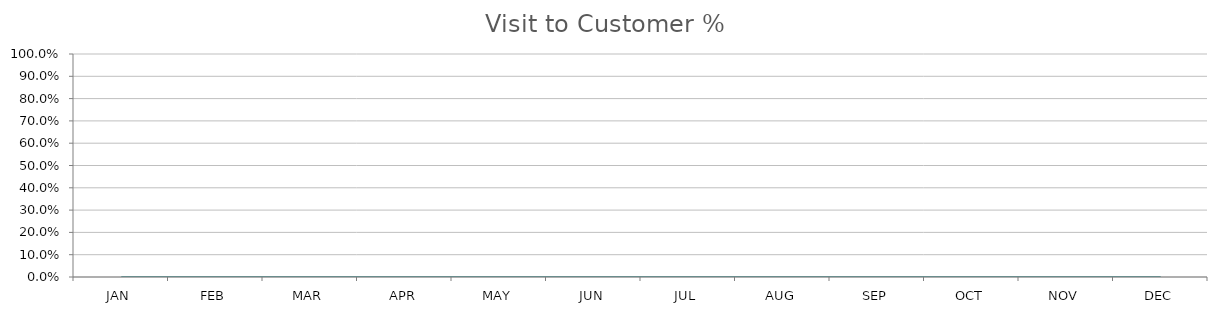
| Category | Visit to Customer % |
|---|---|
| JAN | 0 |
| FEB | 0 |
| MAR | 0 |
| APR | 0 |
| MAY | 0 |
| JUN | 0 |
| JUL | 0 |
| AUG | 0 |
| SEP | 0 |
| OCT | 0 |
| NOV | 0 |
| DEC | 0 |